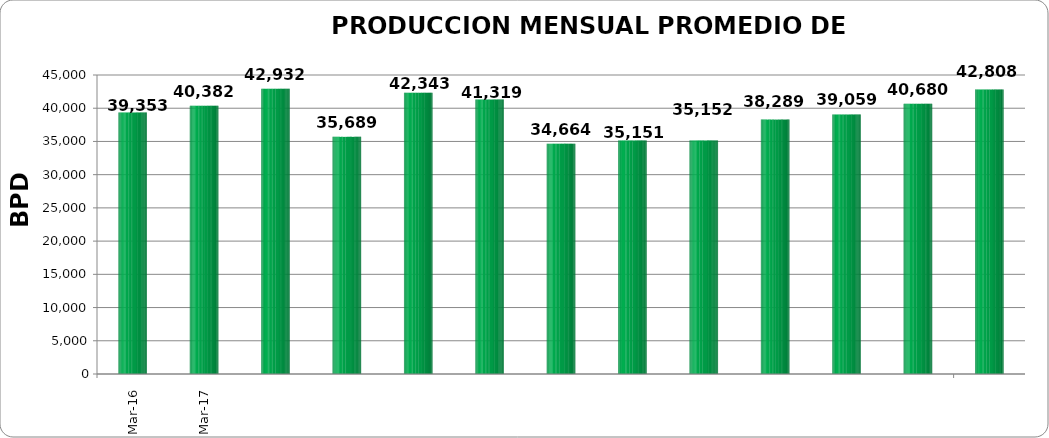
| Category | TOTAL PAIS 
(BPD) #¡REF! #¡REF! #¡REF! #¡REF! #¡REF! #¡REF! #¡REF! #¡REF! #¡REF! #¡REF! #¡REF! #¡REF! #¡REF! #¡REF! #¡REF! #¡REF! #¡REF! #¡REF! #¡REF! #¡REF! #¡REF! #¡REF! #¡REF! #¡REF! #¡REF! #¡REF! #¡REF! #¡REF! #¡REF! #¡REF! #¡REF! #¡REF! #¡REF! #¡REF! |
|---|---|
| 2016-03-01 | 39352.774 |
| 2016-04-01 | 40382 |
| 2016-05-01 | 42932.129 |
| 2016-06-01 | 35689.484 |
| 2016-07-01 | 42342.774 |
| 2016-08-01 | 41318.968 |
| 2016-09-01 | 34664.167 |
| 2016-10-01 | 35151.065 |
| 2016-11-01 | 35152.433 |
| 2016-12-01 | 38288.645 |
| 2017-01-01 | 39058.903 |
| 2017-02-01 | 40679.714 |
| 2017-03-01 | 42807.645 |